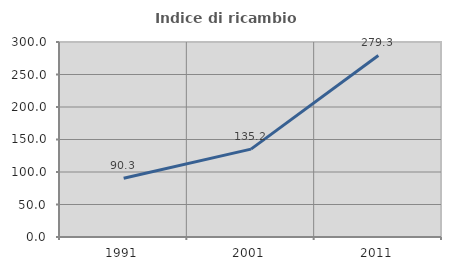
| Category | Indice di ricambio occupazionale  |
|---|---|
| 1991.0 | 90.278 |
| 2001.0 | 135.194 |
| 2011.0 | 279.323 |